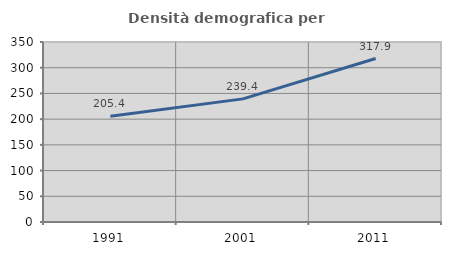
| Category | Densità demografica |
|---|---|
| 1991.0 | 205.417 |
| 2001.0 | 239.407 |
| 2011.0 | 317.855 |